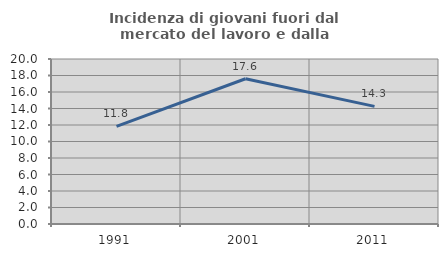
| Category | Incidenza di giovani fuori dal mercato del lavoro e dalla formazione  |
|---|---|
| 1991.0 | 11.844 |
| 2001.0 | 17.609 |
| 2011.0 | 14.254 |